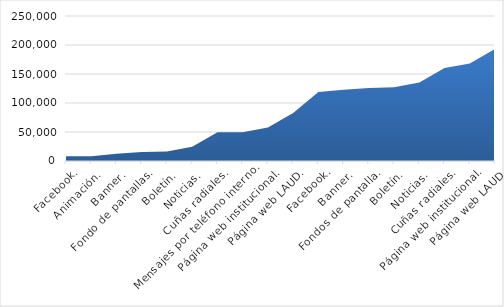
| Category | Series 0 |
|---|---|
| Facebook. | 8096 |
| Animación. | 8397 |
| Banner. | 12397 |
| Fondo de pantallas. | 15358 |
| Boletín. | 16421 |
| Noticias. | 24421 |
| Cuñas radiales. | 49421 |
| Mensajes por teléfono interno. | 49621 |
| Página web institucional. | 57621 |
| Página web LAUD. | 82621 |
|  Facebook. | 118918 |
|  Banner. | 122918 |
|  Fondos de pantalla. | 125879 |
|  Boletín. | 127288 |
|  Noticias. | 135288 |
|  Cuñas radiales. | 160288 |
|  Página web institucional. | 168288 |
|  Página web LAUD. | 193288 |